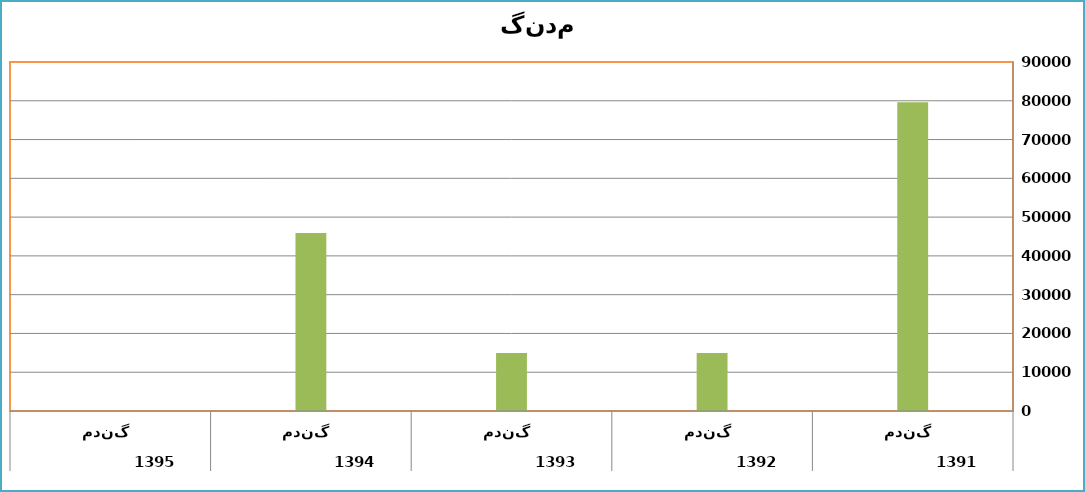
| Category | Series 0 | Series 1 | Series 2 | Series 3 | Series 4 |
|---|---|---|---|---|---|
| 0 | 0 | 0 | 79600 | 0 | 0 |
| 1 | 0 | 0 | 14985 | 0 | 0 |
| 2 | 0 | 0 | 14985 | 0 | 0 |
| 3 | 0 | 0 | 45925 | 0 | 0 |
| 4 | 0 | 0 | 0 | 0 | 0 |